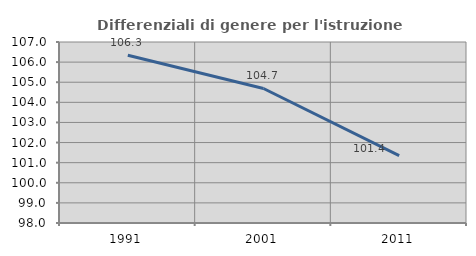
| Category | Differenziali di genere per l'istruzione superiore |
|---|---|
| 1991.0 | 106.344 |
| 2001.0 | 104.689 |
| 2011.0 | 101.352 |